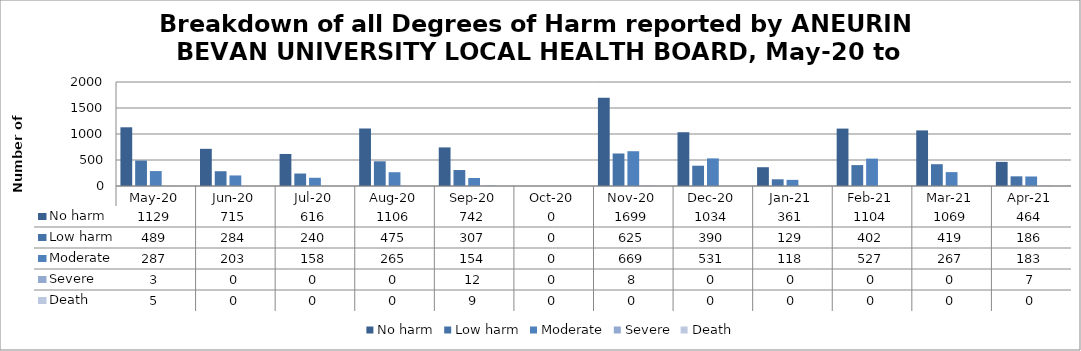
| Category | No harm | Low harm | Moderate | Severe | Death |
|---|---|---|---|---|---|
| May-20 | 1129 | 489 | 287 | 3 | 5 |
| Jun-20 | 715 | 284 | 203 | 0 | 0 |
| Jul-20 | 616 | 240 | 158 | 0 | 0 |
| Aug-20 | 1106 | 475 | 265 | 0 | 0 |
| Sep-20 | 742 | 307 | 154 | 12 | 9 |
| Oct-20 | 0 | 0 | 0 | 0 | 0 |
| Nov-20 | 1699 | 625 | 669 | 8 | 0 |
| Dec-20 | 1034 | 390 | 531 | 0 | 0 |
| Jan-21 | 361 | 129 | 118 | 0 | 0 |
| Feb-21 | 1104 | 402 | 527 | 0 | 0 |
| Mar-21 | 1069 | 419 | 267 | 0 | 0 |
| Apr-21 | 464 | 186 | 183 | 7 | 0 |